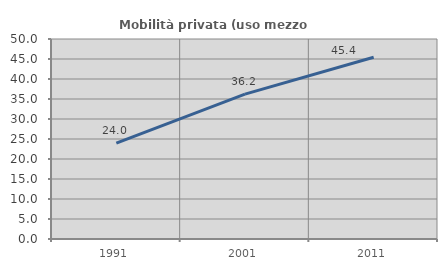
| Category | Mobilità privata (uso mezzo privato) |
|---|---|
| 1991.0 | 23.973 |
| 2001.0 | 36.207 |
| 2011.0 | 45.421 |